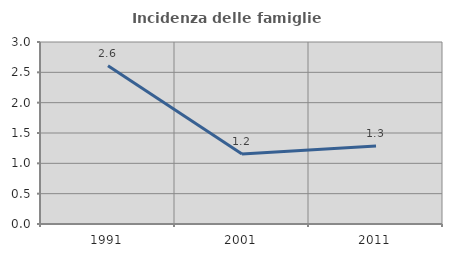
| Category | Incidenza delle famiglie numerose |
|---|---|
| 1991.0 | 2.61 |
| 2001.0 | 1.154 |
| 2011.0 | 1.284 |